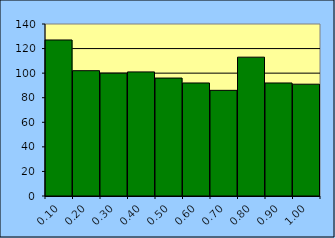
| Category | Series 0 |
|---|---|
| 0.1 | 127 |
| 0.2 | 102 |
| 0.3 | 100 |
| 0.4 | 101 |
| 0.5 | 96 |
| 0.6 | 92 |
| 0.7 | 86 |
| 0.8 | 113 |
| 0.9 | 92 |
| 1.0 | 91 |